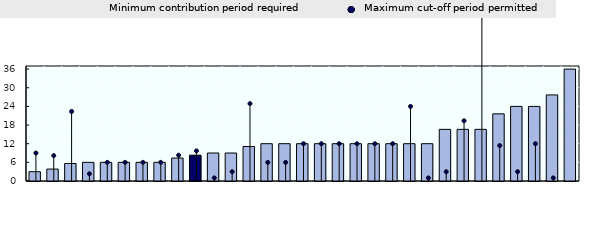
| Category | Minimum contribution period required |
|---|---|
|  | 3 |
|  | 3.837 |
| France | 5.631 |
|  | 6 |
| Japan | 6 |
| Luxembourg | 6 |
| Sweden | 6 |
| Finland | 6 |
|  | 7.385 |
|  | 8.308 |
| Slovenia | 9 |
| Latvia | 9 |
| Denmark | 11.1 |
| Israel | 12 |
| Poland | 12 |
| Austria | 12 |
| Czech Republic | 12 |
| Germany | 12 |
| Italy | 12 |
| Switzerland | 12 |
| United Kingdom | 12 |
| Estonia | 12 |
| Chile | 12 |
| Portugal | 16.615 |
| Hungary | 16.615 |
| Spain | 16.615 |
| Belgium | 21.6 |
|  | 24 |
| Slovak Republic | 24 |
| Turkey | 27.692 |
| Mexico | 36 |